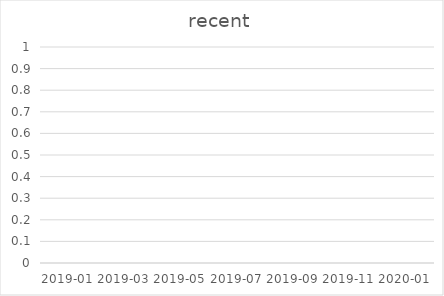
| Category | Series 0 |
|---|---|
| 2019-01 | 0 |
| 2019-03 | 0 |
| 2019-05 | 0 |
| 2019-07 | 0 |
| 2019-09 | 0 |
| 2019-11 | 0 |
| 2020-01 | 0 |